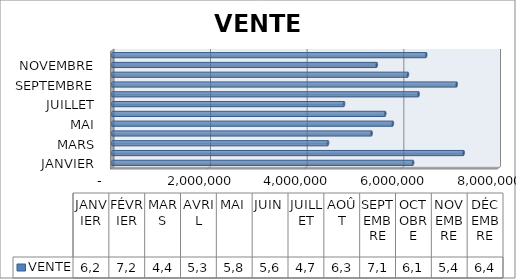
| Category | VENTE |
|---|---|
| JANVIER | 6225403 |
| FÉVRIER | 7271135 |
| MARS | 4464612 |
| AVRIL | 5366536 |
| MAI | 5806030 |
| JUIN | 5647920 |
| JUILLET | 4796570 |
| AOÛT | 6338545 |
| SEPTEMBRE | 7127490 |
| OCTOBRE | 6118348 |
| NOVEMBRE | 5474102 |
| DÉCEMBRE | 6495930 |